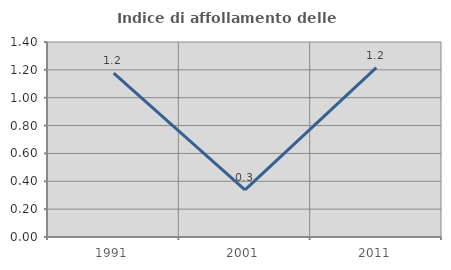
| Category | Indice di affollamento delle abitazioni  |
|---|---|
| 1991.0 | 1.176 |
| 2001.0 | 0.339 |
| 2011.0 | 1.216 |